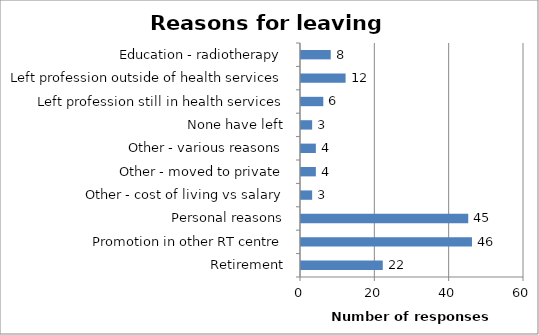
| Category | Number |
|---|---|
| Retirement | 22 |
| Promotion in other RT centre | 46 |
| Personal reasons | 45 |
| Other - cost of living vs salary | 3 |
| Other - moved to private | 4 |
| Other - various reasons | 4 |
| None have left | 3 |
| Left profession still in health services | 6 |
| Left profession outside of health services | 12 |
| Education - radiotherapy | 8 |